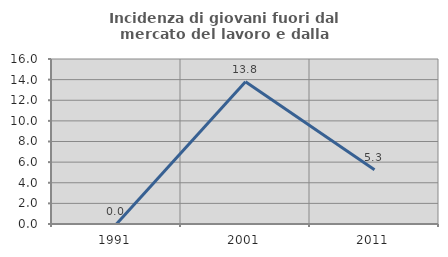
| Category | Incidenza di giovani fuori dal mercato del lavoro e dalla formazione  |
|---|---|
| 1991.0 | 0 |
| 2001.0 | 13.793 |
| 2011.0 | 5.263 |